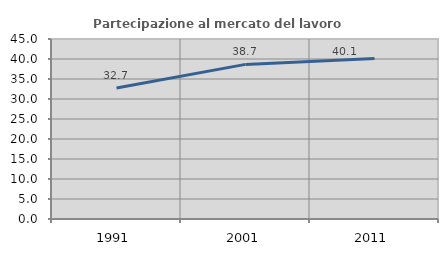
| Category | Partecipazione al mercato del lavoro  femminile |
|---|---|
| 1991.0 | 32.741 |
| 2001.0 | 38.65 |
| 2011.0 | 40.104 |